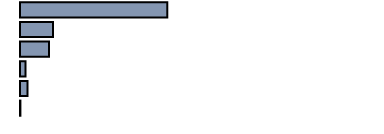
| Category | 37,6 |
|---|---|
| 0 | 41.257 |
| 1 | 9.225 |
| 2 | 8.119 |
| 3 | 1.526 |
| 4 | 2.115 |
| 5 | 0.111 |